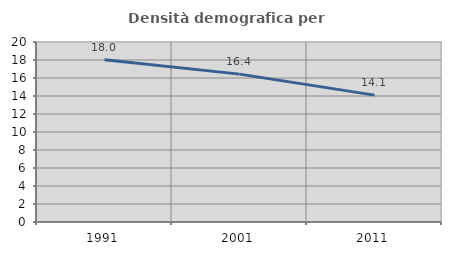
| Category | Densità demografica |
|---|---|
| 1991.0 | 18.037 |
| 2001.0 | 16.43 |
| 2011.0 | 14.098 |